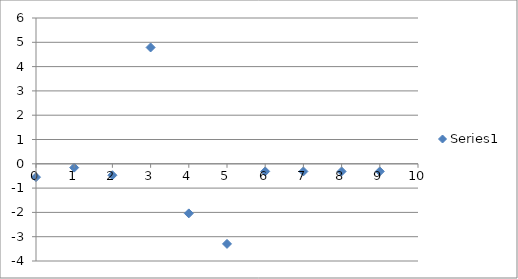
| Category | Series 0 |
|---|---|
| 0.0 | -0.549 |
| 1.0 | -0.157 |
| 2.0 | -0.471 |
| 3.0 | 4.787 |
| 4.0 | -2.041 |
| 5.0 | -3.296 |
| 6.0 | -0.314 |
| 7.0 | -0.314 |
| 8.0 | -0.314 |
| 9.0 | -0.314 |